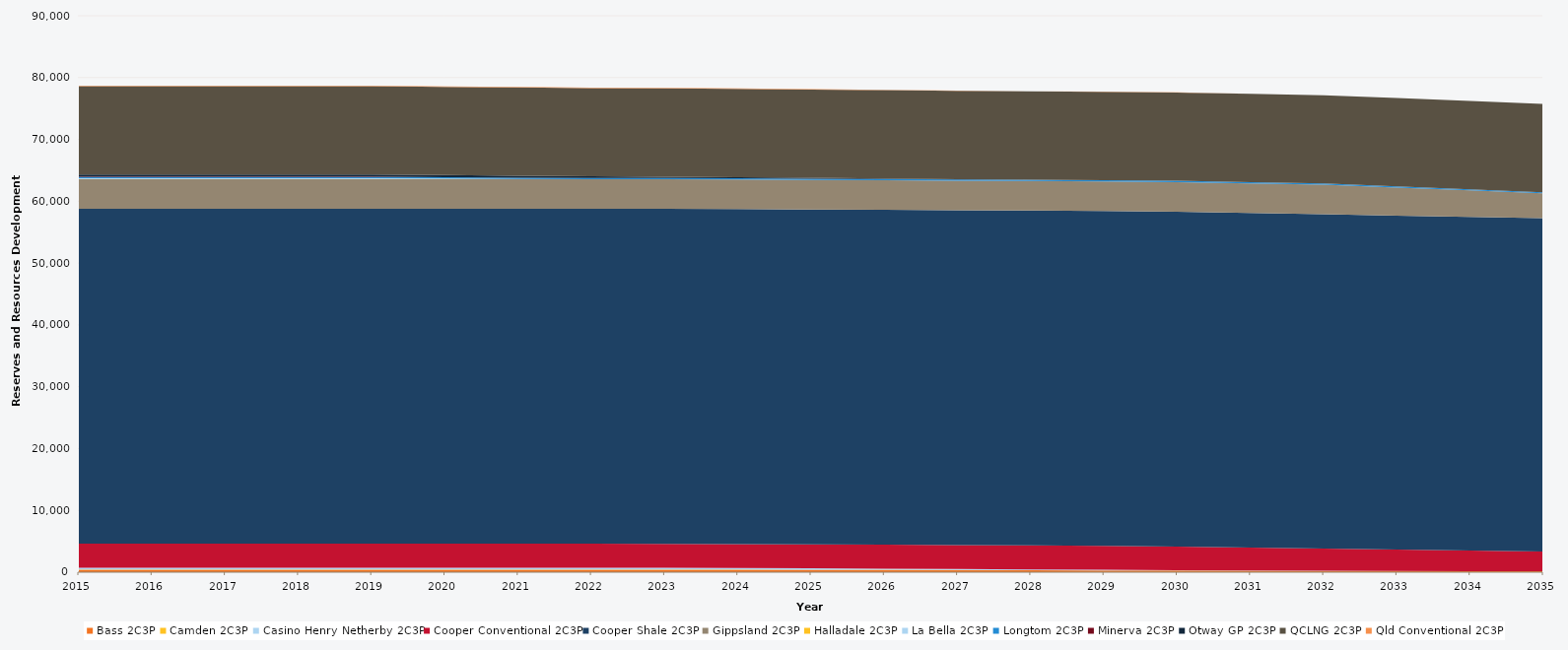
| Category | Bass 2C3P | Camden 2C3P | Casino Henry Netherby 2C3P | Cooper Conventional 2C3P | Cooper Shale 2C3P | Gippsland 2C3P | Halladale 2C3P | La Bella 2C3P | Longtom 2C3P | Minerva 2C3P | Otway GP 2C3P | QCLNG 2C3P | Qld Conventional 2C3P |
|---|---|---|---|---|---|---|---|---|---|---|---|---|---|
| 2015.0 | 409.522 | 36 | 273.008 | 3883.683 | 54170.916 | 4777.394 | 44 | 126.4 | 208.266 | 66.247 | 328.425 | 14279 | 88.984 |
| 2016.0 | 409.522 | 36 | 273.008 | 3883.683 | 54170.916 | 4777.394 | 44 | 126.4 | 208.266 | 66.247 | 328.425 | 14279 | 88.984 |
| 2017.0 | 409.522 | 36 | 273.008 | 3883.683 | 54170.916 | 4777.394 | 44 | 126.4 | 208.266 | 66.247 | 328.425 | 14279 | 88.984 |
| 2018.0 | 409.522 | 36 | 273.008 | 3883.683 | 54170.916 | 4777.394 | 44 | 126.4 | 208.266 | 66.247 | 328.425 | 14279 | 88.984 |
| 2019.0 | 409.522 | 36 | 273.008 | 3883.683 | 54170.916 | 4777.394 | 44 | 126.4 | 208.266 | 66.247 | 328.425 | 14279 | 88.984 |
| 2020.0 | 409.522 | 36 | 273.008 | 3883.683 | 54170.916 | 4777.394 | 44 | 91.073 | 208.266 | 0 | 328.425 | 14279 | 88.984 |
| 2021.0 | 409.522 | 36 | 273.008 | 3883.683 | 54170.916 | 4777.394 | 23.859 | 32.21 | 208.266 | 0 | 309.737 | 14279 | 88.984 |
| 2022.0 | 409.522 | 36 | 273.008 | 3883.683 | 54170.916 | 4777.394 | 15.758 | 0 | 208.198 | 0 | 247.417 | 14279 | 85.634 |
| 2023.0 | 409.522 | 36 | 264.908 | 3883.253 | 54170.916 | 4777.394 | 15.758 | 0 | 208.198 | 0 | 203.186 | 14279 | 77.604 |
| 2024.0 | 409.522 | 31.695 | 235.708 | 3882.771 | 54170.624 | 4777.394 | 5.398 | 0 | 208.198 | 0 | 169.817 | 14279 | 69.574 |
| 2025.0 | 385.947 | 26.205 | 206.428 | 3881.837 | 54169.943 | 4777.394 | 0 | 0 | 208.048 | 0 | 128.684 | 14279 | 61.522 |
| 2026.0 | 361.492 | 20.73 | 177.228 | 3881.652 | 54169.645 | 4777.394 | 0 | 0 | 208.048 | 0 | 84.741 | 14279 | 53.492 |
| 2027.0 | 337.037 | 15.255 | 148.028 | 3880.718 | 54169.645 | 4777.394 | 0 | 0 | 208.048 | 0 | 40.961 | 14279 | 45.462 |
| 2028.0 | 312.582 | 9.78 | 118.828 | 3879.796 | 54169.645 | 4777.394 | 0 | 0 | 208.048 | 0 | 0 | 14279 | 37.432 |
| 2029.0 | 288.06 | 4.29 | 89.548 | 3879.034 | 54169.645 | 4777.394 | 0 | 0 | 207.244 | 0 | 0 | 14279 | 29.38 |
| 2030.0 | 263.605 | 2.525 | 60.348 | 3831.096 | 54158.023 | 4777.394 | 0 | 0 | 206.547 | 0 | 0 | 14279 | 21.35 |
| 2031.0 | 239.15 | 0.994 | 31.281 | 3710.635 | 54118.761 | 4777.394 | 0 | 0 | 206.547 | 0 | 0 | 14279 | 13.32 |
| 2032.0 | 214.695 | 0 | 17.817 | 3586.041 | 54067.03 | 4776.64 | 0 | 0 | 206.547 | 0 | 0 | 14279 | 8.133 |
| 2033.0 | 190.173 | 0 | 10.761 | 3457.738 | 54017.506 | 4532.273 | 0 | 0 | 193.676 | 0 | 0 | 14279 | 6.424 |
| 2034.0 | 165.718 | 0 | 4.262 | 3327.605 | 53969.95 | 4280.692 | 0 | 0 | 181.019 | 0 | 0 | 14279 | 2.024 |
| 2035.0 | 141.263 | 0 | 0 | 3192.881 | 53926.589 | 4024.409 | 0 | 0 | 166.808 | 0 | 0 | 14279 | 0 |